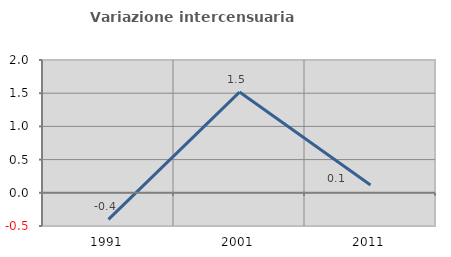
| Category | Variazione intercensuaria annua |
|---|---|
| 1991.0 | -0.4 |
| 2001.0 | 1.517 |
| 2011.0 | 0.117 |